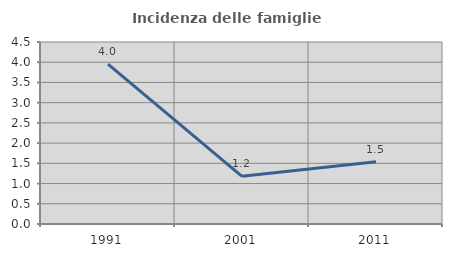
| Category | Incidenza delle famiglie numerose |
|---|---|
| 1991.0 | 3.952 |
| 2001.0 | 1.178 |
| 2011.0 | 1.54 |